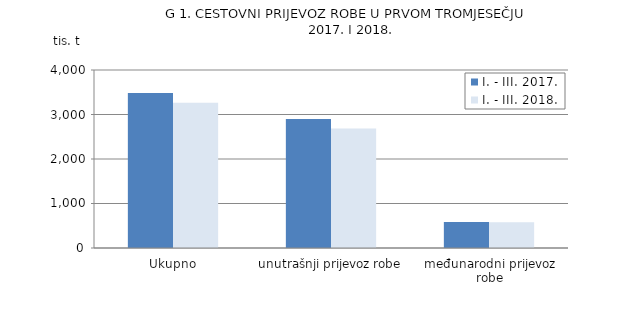
| Category | I. - III. 2017. | I. - III. 2018. |
|---|---|---|
| Ukupno | 3481 | 3265 |
| unutrašnji prijevoz robe | 2899 | 2686 |
| međunarodni prijevoz robe | 582 | 579 |